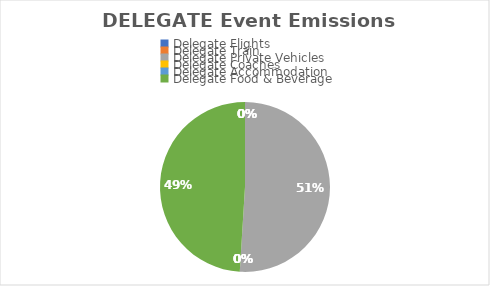
| Category | Series 0 |
|---|---|
| Delegate Flights | 0 |
| Delegate Train | 0 |
| Delegate Private Vehicles | 0.26 |
| Delegate Coaches | 0 |
| Delegate Accommodation | 0 |
| Delegate Food & Beverage | 0.25 |